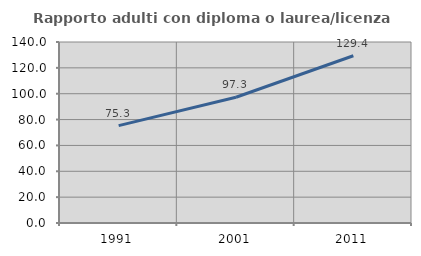
| Category | Rapporto adulti con diploma o laurea/licenza media  |
|---|---|
| 1991.0 | 75.294 |
| 2001.0 | 97.267 |
| 2011.0 | 129.374 |